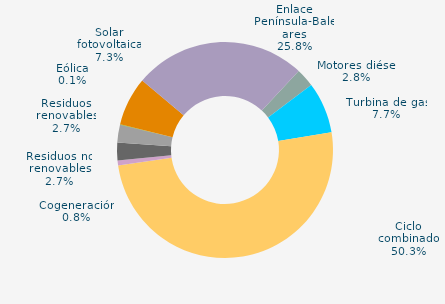
| Category | Series 0 |
|---|---|
| Carbón | 0 |
| Motores diésel | 2.763 |
| Turbina de gas | 7.657 |
| Ciclo combinado | 50.328 |
| Generación auxiliar | 0 |
| Cogeneración | 0.765 |
| Residuos no renovables | 2.659 |
| Residuos renovables | 2.659 |
| Eólica | 0.054 |
| Solar fotovoltaica | 7.275 |
| Otras renovables | 0.02 |
| Enlace Península-Baleares | 25.821 |